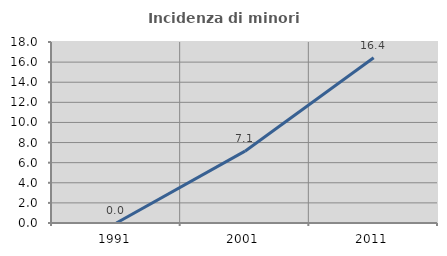
| Category | Incidenza di minori stranieri |
|---|---|
| 1991.0 | 0 |
| 2001.0 | 7.143 |
| 2011.0 | 16.438 |